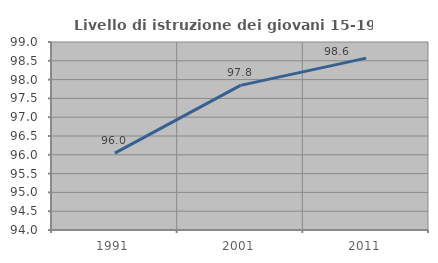
| Category | Livello di istruzione dei giovani 15-19 anni |
|---|---|
| 1991.0 | 96.046 |
| 2001.0 | 97.846 |
| 2011.0 | 98.571 |